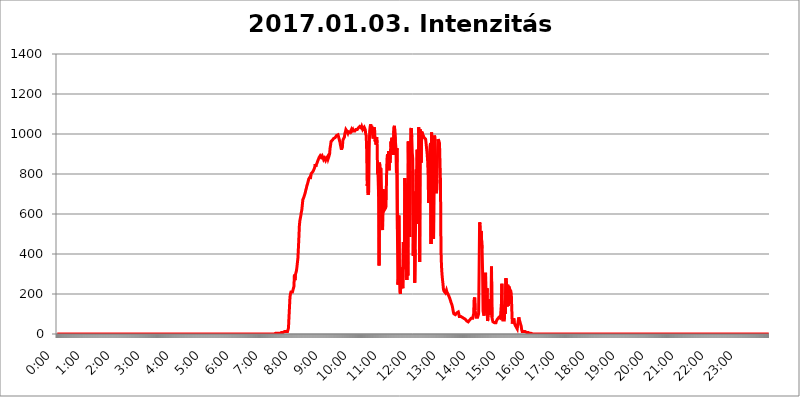
| Category | 2017.01.03. Intenzitás [W/m^2] |
|---|---|
| 0.0 | 0 |
| 0.0006944444444444445 | 0 |
| 0.001388888888888889 | 0 |
| 0.0020833333333333333 | 0 |
| 0.002777777777777778 | 0 |
| 0.003472222222222222 | 0 |
| 0.004166666666666667 | 0 |
| 0.004861111111111111 | 0 |
| 0.005555555555555556 | 0 |
| 0.0062499999999999995 | 0 |
| 0.006944444444444444 | 0 |
| 0.007638888888888889 | 0 |
| 0.008333333333333333 | 0 |
| 0.009027777777777779 | 0 |
| 0.009722222222222222 | 0 |
| 0.010416666666666666 | 0 |
| 0.011111111111111112 | 0 |
| 0.011805555555555555 | 0 |
| 0.012499999999999999 | 0 |
| 0.013194444444444444 | 0 |
| 0.013888888888888888 | 0 |
| 0.014583333333333332 | 0 |
| 0.015277777777777777 | 0 |
| 0.015972222222222224 | 0 |
| 0.016666666666666666 | 0 |
| 0.017361111111111112 | 0 |
| 0.018055555555555557 | 0 |
| 0.01875 | 0 |
| 0.019444444444444445 | 0 |
| 0.02013888888888889 | 0 |
| 0.020833333333333332 | 0 |
| 0.02152777777777778 | 0 |
| 0.022222222222222223 | 0 |
| 0.02291666666666667 | 0 |
| 0.02361111111111111 | 0 |
| 0.024305555555555556 | 0 |
| 0.024999999999999998 | 0 |
| 0.025694444444444447 | 0 |
| 0.02638888888888889 | 0 |
| 0.027083333333333334 | 0 |
| 0.027777777777777776 | 0 |
| 0.02847222222222222 | 0 |
| 0.029166666666666664 | 0 |
| 0.029861111111111113 | 0 |
| 0.030555555555555555 | 0 |
| 0.03125 | 0 |
| 0.03194444444444445 | 0 |
| 0.03263888888888889 | 0 |
| 0.03333333333333333 | 0 |
| 0.034027777777777775 | 0 |
| 0.034722222222222224 | 0 |
| 0.035416666666666666 | 0 |
| 0.036111111111111115 | 0 |
| 0.03680555555555556 | 0 |
| 0.0375 | 0 |
| 0.03819444444444444 | 0 |
| 0.03888888888888889 | 0 |
| 0.03958333333333333 | 0 |
| 0.04027777777777778 | 0 |
| 0.04097222222222222 | 0 |
| 0.041666666666666664 | 0 |
| 0.042361111111111106 | 0 |
| 0.04305555555555556 | 0 |
| 0.043750000000000004 | 0 |
| 0.044444444444444446 | 0 |
| 0.04513888888888889 | 0 |
| 0.04583333333333334 | 0 |
| 0.04652777777777778 | 0 |
| 0.04722222222222222 | 0 |
| 0.04791666666666666 | 0 |
| 0.04861111111111111 | 0 |
| 0.049305555555555554 | 0 |
| 0.049999999999999996 | 0 |
| 0.05069444444444445 | 0 |
| 0.051388888888888894 | 0 |
| 0.052083333333333336 | 0 |
| 0.05277777777777778 | 0 |
| 0.05347222222222222 | 0 |
| 0.05416666666666667 | 0 |
| 0.05486111111111111 | 0 |
| 0.05555555555555555 | 0 |
| 0.05625 | 0 |
| 0.05694444444444444 | 0 |
| 0.057638888888888885 | 0 |
| 0.05833333333333333 | 0 |
| 0.05902777777777778 | 0 |
| 0.059722222222222225 | 0 |
| 0.06041666666666667 | 0 |
| 0.061111111111111116 | 0 |
| 0.06180555555555556 | 0 |
| 0.0625 | 0 |
| 0.06319444444444444 | 0 |
| 0.06388888888888888 | 0 |
| 0.06458333333333334 | 0 |
| 0.06527777777777778 | 0 |
| 0.06597222222222222 | 0 |
| 0.06666666666666667 | 0 |
| 0.06736111111111111 | 0 |
| 0.06805555555555555 | 0 |
| 0.06874999999999999 | 0 |
| 0.06944444444444443 | 0 |
| 0.07013888888888889 | 0 |
| 0.07083333333333333 | 0 |
| 0.07152777777777779 | 0 |
| 0.07222222222222223 | 0 |
| 0.07291666666666667 | 0 |
| 0.07361111111111111 | 0 |
| 0.07430555555555556 | 0 |
| 0.075 | 0 |
| 0.07569444444444444 | 0 |
| 0.0763888888888889 | 0 |
| 0.07708333333333334 | 0 |
| 0.07777777777777778 | 0 |
| 0.07847222222222222 | 0 |
| 0.07916666666666666 | 0 |
| 0.0798611111111111 | 0 |
| 0.08055555555555556 | 0 |
| 0.08125 | 0 |
| 0.08194444444444444 | 0 |
| 0.08263888888888889 | 0 |
| 0.08333333333333333 | 0 |
| 0.08402777777777777 | 0 |
| 0.08472222222222221 | 0 |
| 0.08541666666666665 | 0 |
| 0.08611111111111112 | 0 |
| 0.08680555555555557 | 0 |
| 0.08750000000000001 | 0 |
| 0.08819444444444445 | 0 |
| 0.08888888888888889 | 0 |
| 0.08958333333333333 | 0 |
| 0.09027777777777778 | 0 |
| 0.09097222222222222 | 0 |
| 0.09166666666666667 | 0 |
| 0.09236111111111112 | 0 |
| 0.09305555555555556 | 0 |
| 0.09375 | 0 |
| 0.09444444444444444 | 0 |
| 0.09513888888888888 | 0 |
| 0.09583333333333333 | 0 |
| 0.09652777777777777 | 0 |
| 0.09722222222222222 | 0 |
| 0.09791666666666667 | 0 |
| 0.09861111111111111 | 0 |
| 0.09930555555555555 | 0 |
| 0.09999999999999999 | 0 |
| 0.10069444444444443 | 0 |
| 0.1013888888888889 | 0 |
| 0.10208333333333335 | 0 |
| 0.10277777777777779 | 0 |
| 0.10347222222222223 | 0 |
| 0.10416666666666667 | 0 |
| 0.10486111111111111 | 0 |
| 0.10555555555555556 | 0 |
| 0.10625 | 0 |
| 0.10694444444444444 | 0 |
| 0.1076388888888889 | 0 |
| 0.10833333333333334 | 0 |
| 0.10902777777777778 | 0 |
| 0.10972222222222222 | 0 |
| 0.1111111111111111 | 0 |
| 0.11180555555555556 | 0 |
| 0.11180555555555556 | 0 |
| 0.1125 | 0 |
| 0.11319444444444444 | 0 |
| 0.11388888888888889 | 0 |
| 0.11458333333333333 | 0 |
| 0.11527777777777777 | 0 |
| 0.11597222222222221 | 0 |
| 0.11666666666666665 | 0 |
| 0.1173611111111111 | 0 |
| 0.11805555555555557 | 0 |
| 0.11944444444444445 | 0 |
| 0.12013888888888889 | 0 |
| 0.12083333333333333 | 0 |
| 0.12152777777777778 | 0 |
| 0.12222222222222223 | 0 |
| 0.12291666666666667 | 0 |
| 0.12291666666666667 | 0 |
| 0.12361111111111112 | 0 |
| 0.12430555555555556 | 0 |
| 0.125 | 0 |
| 0.12569444444444444 | 0 |
| 0.12638888888888888 | 0 |
| 0.12708333333333333 | 0 |
| 0.16875 | 0 |
| 0.12847222222222224 | 0 |
| 0.12916666666666668 | 0 |
| 0.12986111111111112 | 0 |
| 0.13055555555555556 | 0 |
| 0.13125 | 0 |
| 0.13194444444444445 | 0 |
| 0.1326388888888889 | 0 |
| 0.13333333333333333 | 0 |
| 0.13402777777777777 | 0 |
| 0.13402777777777777 | 0 |
| 0.13472222222222222 | 0 |
| 0.13541666666666666 | 0 |
| 0.1361111111111111 | 0 |
| 0.13749999999999998 | 0 |
| 0.13819444444444443 | 0 |
| 0.1388888888888889 | 0 |
| 0.13958333333333334 | 0 |
| 0.14027777777777778 | 0 |
| 0.14097222222222222 | 0 |
| 0.14166666666666666 | 0 |
| 0.1423611111111111 | 0 |
| 0.14305555555555557 | 0 |
| 0.14375000000000002 | 0 |
| 0.14444444444444446 | 0 |
| 0.1451388888888889 | 0 |
| 0.1451388888888889 | 0 |
| 0.14652777777777778 | 0 |
| 0.14722222222222223 | 0 |
| 0.14791666666666667 | 0 |
| 0.1486111111111111 | 0 |
| 0.14930555555555555 | 0 |
| 0.15 | 0 |
| 0.15069444444444444 | 0 |
| 0.15138888888888888 | 0 |
| 0.15208333333333332 | 0 |
| 0.15277777777777776 | 0 |
| 0.15347222222222223 | 0 |
| 0.15416666666666667 | 0 |
| 0.15486111111111112 | 0 |
| 0.15555555555555556 | 0 |
| 0.15625 | 0 |
| 0.15694444444444444 | 0 |
| 0.15763888888888888 | 0 |
| 0.15833333333333333 | 0 |
| 0.15902777777777777 | 0 |
| 0.15972222222222224 | 0 |
| 0.16041666666666668 | 0 |
| 0.16111111111111112 | 0 |
| 0.16180555555555556 | 0 |
| 0.1625 | 0 |
| 0.16319444444444445 | 0 |
| 0.1638888888888889 | 0 |
| 0.16458333333333333 | 0 |
| 0.16527777777777777 | 0 |
| 0.16597222222222222 | 0 |
| 0.16666666666666666 | 0 |
| 0.1673611111111111 | 0 |
| 0.16805555555555554 | 0 |
| 0.16874999999999998 | 0 |
| 0.16944444444444443 | 0 |
| 0.17013888888888887 | 0 |
| 0.1708333333333333 | 0 |
| 0.17152777777777775 | 0 |
| 0.17222222222222225 | 0 |
| 0.1729166666666667 | 0 |
| 0.17361111111111113 | 0 |
| 0.17430555555555557 | 0 |
| 0.17500000000000002 | 0 |
| 0.17569444444444446 | 0 |
| 0.1763888888888889 | 0 |
| 0.17708333333333334 | 0 |
| 0.17777777777777778 | 0 |
| 0.17847222222222223 | 0 |
| 0.17916666666666667 | 0 |
| 0.1798611111111111 | 0 |
| 0.18055555555555555 | 0 |
| 0.18125 | 0 |
| 0.18194444444444444 | 0 |
| 0.1826388888888889 | 0 |
| 0.18333333333333335 | 0 |
| 0.1840277777777778 | 0 |
| 0.18472222222222223 | 0 |
| 0.18541666666666667 | 0 |
| 0.18611111111111112 | 0 |
| 0.18680555555555556 | 0 |
| 0.1875 | 0 |
| 0.18819444444444444 | 0 |
| 0.18888888888888888 | 0 |
| 0.18958333333333333 | 0 |
| 0.19027777777777777 | 0 |
| 0.1909722222222222 | 0 |
| 0.19166666666666665 | 0 |
| 0.19236111111111112 | 0 |
| 0.19305555555555554 | 0 |
| 0.19375 | 0 |
| 0.19444444444444445 | 0 |
| 0.1951388888888889 | 0 |
| 0.19583333333333333 | 0 |
| 0.19652777777777777 | 0 |
| 0.19722222222222222 | 0 |
| 0.19791666666666666 | 0 |
| 0.1986111111111111 | 0 |
| 0.19930555555555554 | 0 |
| 0.19999999999999998 | 0 |
| 0.20069444444444443 | 0 |
| 0.20138888888888887 | 0 |
| 0.2020833333333333 | 0 |
| 0.2027777777777778 | 0 |
| 0.2034722222222222 | 0 |
| 0.2041666666666667 | 0 |
| 0.20486111111111113 | 0 |
| 0.20555555555555557 | 0 |
| 0.20625000000000002 | 0 |
| 0.20694444444444446 | 0 |
| 0.2076388888888889 | 0 |
| 0.20833333333333334 | 0 |
| 0.20902777777777778 | 0 |
| 0.20972222222222223 | 0 |
| 0.21041666666666667 | 0 |
| 0.2111111111111111 | 0 |
| 0.21180555555555555 | 0 |
| 0.2125 | 0 |
| 0.21319444444444444 | 0 |
| 0.2138888888888889 | 0 |
| 0.21458333333333335 | 0 |
| 0.2152777777777778 | 0 |
| 0.21597222222222223 | 0 |
| 0.21666666666666667 | 0 |
| 0.21736111111111112 | 0 |
| 0.21805555555555556 | 0 |
| 0.21875 | 0 |
| 0.21944444444444444 | 0 |
| 0.22013888888888888 | 0 |
| 0.22083333333333333 | 0 |
| 0.22152777777777777 | 0 |
| 0.2222222222222222 | 0 |
| 0.22291666666666665 | 0 |
| 0.2236111111111111 | 0 |
| 0.22430555555555556 | 0 |
| 0.225 | 0 |
| 0.22569444444444445 | 0 |
| 0.2263888888888889 | 0 |
| 0.22708333333333333 | 0 |
| 0.22777777777777777 | 0 |
| 0.22847222222222222 | 0 |
| 0.22916666666666666 | 0 |
| 0.2298611111111111 | 0 |
| 0.23055555555555554 | 0 |
| 0.23124999999999998 | 0 |
| 0.23194444444444443 | 0 |
| 0.23263888888888887 | 0 |
| 0.2333333333333333 | 0 |
| 0.2340277777777778 | 0 |
| 0.2347222222222222 | 0 |
| 0.2354166666666667 | 0 |
| 0.23611111111111113 | 0 |
| 0.23680555555555557 | 0 |
| 0.23750000000000002 | 0 |
| 0.23819444444444446 | 0 |
| 0.2388888888888889 | 0 |
| 0.23958333333333334 | 0 |
| 0.24027777777777778 | 0 |
| 0.24097222222222223 | 0 |
| 0.24166666666666667 | 0 |
| 0.2423611111111111 | 0 |
| 0.24305555555555555 | 0 |
| 0.24375 | 0 |
| 0.24444444444444446 | 0 |
| 0.24513888888888888 | 0 |
| 0.24583333333333335 | 0 |
| 0.2465277777777778 | 0 |
| 0.24722222222222223 | 0 |
| 0.24791666666666667 | 0 |
| 0.24861111111111112 | 0 |
| 0.24930555555555556 | 0 |
| 0.25 | 0 |
| 0.25069444444444444 | 0 |
| 0.2513888888888889 | 0 |
| 0.2520833333333333 | 0 |
| 0.25277777777777777 | 0 |
| 0.2534722222222222 | 0 |
| 0.25416666666666665 | 0 |
| 0.2548611111111111 | 0 |
| 0.2555555555555556 | 0 |
| 0.25625000000000003 | 0 |
| 0.2569444444444445 | 0 |
| 0.2576388888888889 | 0 |
| 0.25833333333333336 | 0 |
| 0.2590277777777778 | 0 |
| 0.25972222222222224 | 0 |
| 0.2604166666666667 | 0 |
| 0.2611111111111111 | 0 |
| 0.26180555555555557 | 0 |
| 0.2625 | 0 |
| 0.26319444444444445 | 0 |
| 0.2638888888888889 | 0 |
| 0.26458333333333334 | 0 |
| 0.2652777777777778 | 0 |
| 0.2659722222222222 | 0 |
| 0.26666666666666666 | 0 |
| 0.2673611111111111 | 0 |
| 0.26805555555555555 | 0 |
| 0.26875 | 0 |
| 0.26944444444444443 | 0 |
| 0.2701388888888889 | 0 |
| 0.2708333333333333 | 0 |
| 0.27152777777777776 | 0 |
| 0.2722222222222222 | 0 |
| 0.27291666666666664 | 0 |
| 0.2736111111111111 | 0 |
| 0.2743055555555555 | 0 |
| 0.27499999999999997 | 0 |
| 0.27569444444444446 | 0 |
| 0.27638888888888885 | 0 |
| 0.27708333333333335 | 0 |
| 0.2777777777777778 | 0 |
| 0.27847222222222223 | 0 |
| 0.2791666666666667 | 0 |
| 0.2798611111111111 | 0 |
| 0.28055555555555556 | 0 |
| 0.28125 | 0 |
| 0.28194444444444444 | 0 |
| 0.2826388888888889 | 0 |
| 0.2833333333333333 | 0 |
| 0.28402777777777777 | 0 |
| 0.2847222222222222 | 0 |
| 0.28541666666666665 | 0 |
| 0.28611111111111115 | 0 |
| 0.28680555555555554 | 0 |
| 0.28750000000000003 | 0 |
| 0.2881944444444445 | 0 |
| 0.2888888888888889 | 0 |
| 0.28958333333333336 | 0 |
| 0.2902777777777778 | 0 |
| 0.29097222222222224 | 0 |
| 0.2916666666666667 | 0 |
| 0.2923611111111111 | 0 |
| 0.29305555555555557 | 0 |
| 0.29375 | 0 |
| 0.29444444444444445 | 0 |
| 0.2951388888888889 | 0 |
| 0.29583333333333334 | 0 |
| 0.2965277777777778 | 0 |
| 0.2972222222222222 | 0 |
| 0.29791666666666666 | 0 |
| 0.2986111111111111 | 0 |
| 0.29930555555555555 | 0 |
| 0.3 | 0 |
| 0.30069444444444443 | 0 |
| 0.3013888888888889 | 0 |
| 0.3020833333333333 | 0 |
| 0.30277777777777776 | 0 |
| 0.3034722222222222 | 0 |
| 0.30416666666666664 | 0 |
| 0.3048611111111111 | 0 |
| 0.3055555555555555 | 0 |
| 0.30624999999999997 | 3.525 |
| 0.3069444444444444 | 3.525 |
| 0.3076388888888889 | 3.525 |
| 0.30833333333333335 | 3.525 |
| 0.3090277777777778 | 3.525 |
| 0.30972222222222223 | 3.525 |
| 0.3104166666666667 | 3.525 |
| 0.3111111111111111 | 3.525 |
| 0.31180555555555556 | 3.525 |
| 0.3125 | 3.525 |
| 0.31319444444444444 | 3.525 |
| 0.3138888888888889 | 7.887 |
| 0.3145833333333333 | 7.887 |
| 0.31527777777777777 | 7.887 |
| 0.3159722222222222 | 7.887 |
| 0.31666666666666665 | 7.887 |
| 0.31736111111111115 | 7.887 |
| 0.31805555555555554 | 7.887 |
| 0.31875000000000003 | 12.257 |
| 0.3194444444444445 | 12.257 |
| 0.3201388888888889 | 12.257 |
| 0.32083333333333336 | 12.257 |
| 0.3215277777777778 | 12.257 |
| 0.32222222222222224 | 12.257 |
| 0.3229166666666667 | 12.257 |
| 0.3236111111111111 | 21.024 |
| 0.32430555555555557 | 29.823 |
| 0.325 | 83.205 |
| 0.32569444444444445 | 132.814 |
| 0.3263888888888889 | 182.82 |
| 0.32708333333333334 | 201.058 |
| 0.3277777777777778 | 210.182 |
| 0.3284722222222222 | 214.746 |
| 0.32916666666666666 | 210.182 |
| 0.3298611111111111 | 210.182 |
| 0.33055555555555555 | 210.182 |
| 0.33125 | 228.436 |
| 0.33194444444444443 | 237.564 |
| 0.3326388888888889 | 296.808 |
| 0.3333333333333333 | 269.49 |
| 0.3340277777777778 | 296.808 |
| 0.3347222222222222 | 301.354 |
| 0.3354166666666667 | 314.98 |
| 0.3361111111111111 | 333.113 |
| 0.3368055555555556 | 333.113 |
| 0.33749999999999997 | 378.224 |
| 0.33819444444444446 | 427.39 |
| 0.33888888888888885 | 480.356 |
| 0.33958333333333335 | 541.121 |
| 0.34027777777777773 | 566.793 |
| 0.34097222222222223 | 579.542 |
| 0.3416666666666666 | 592.233 |
| 0.3423611111111111 | 609.062 |
| 0.3430555555555555 | 621.613 |
| 0.34375 | 646.537 |
| 0.3444444444444445 | 671.22 |
| 0.3451388888888889 | 671.22 |
| 0.3458333333333334 | 683.473 |
| 0.34652777777777777 | 683.473 |
| 0.34722222222222227 | 699.717 |
| 0.34791666666666665 | 707.8 |
| 0.34861111111111115 | 719.877 |
| 0.34930555555555554 | 727.896 |
| 0.35000000000000003 | 739.877 |
| 0.3506944444444444 | 743.859 |
| 0.3513888888888889 | 755.766 |
| 0.3520833333333333 | 759.723 |
| 0.3527777777777778 | 775.492 |
| 0.3534722222222222 | 779.42 |
| 0.3541666666666667 | 783.342 |
| 0.3548611111111111 | 775.492 |
| 0.35555555555555557 | 787.258 |
| 0.35625 | 802.868 |
| 0.35694444444444445 | 802.868 |
| 0.3576388888888889 | 802.868 |
| 0.35833333333333334 | 810.641 |
| 0.3590277777777778 | 814.519 |
| 0.3597222222222222 | 810.641 |
| 0.36041666666666666 | 826.123 |
| 0.3611111111111111 | 833.834 |
| 0.36180555555555555 | 849.199 |
| 0.3625 | 837.682 |
| 0.36319444444444443 | 845.365 |
| 0.3638888888888889 | 849.199 |
| 0.3645833333333333 | 856.855 |
| 0.3652777777777778 | 864.493 |
| 0.3659722222222222 | 864.493 |
| 0.3666666666666667 | 868.305 |
| 0.3673611111111111 | 883.516 |
| 0.3680555555555556 | 887.309 |
| 0.36874999999999997 | 891.099 |
| 0.36944444444444446 | 891.099 |
| 0.37013888888888885 | 883.516 |
| 0.37083333333333335 | 883.516 |
| 0.37152777777777773 | 891.099 |
| 0.37222222222222223 | 887.309 |
| 0.3729166666666666 | 879.719 |
| 0.3736111111111111 | 872.114 |
| 0.3743055555555555 | 872.114 |
| 0.375 | 879.719 |
| 0.3756944444444445 | 875.918 |
| 0.3763888888888889 | 868.305 |
| 0.3770833333333334 | 868.305 |
| 0.37777777777777777 | 879.719 |
| 0.37847222222222227 | 883.516 |
| 0.37916666666666665 | 887.309 |
| 0.37986111111111115 | 875.918 |
| 0.38055555555555554 | 875.918 |
| 0.38125000000000003 | 879.719 |
| 0.3819444444444444 | 898.668 |
| 0.3826388888888889 | 928.819 |
| 0.3833333333333333 | 943.832 |
| 0.3840277777777778 | 962.555 |
| 0.3847222222222222 | 958.814 |
| 0.3854166666666667 | 962.555 |
| 0.3861111111111111 | 970.034 |
| 0.38680555555555557 | 970.034 |
| 0.3875 | 977.508 |
| 0.38819444444444445 | 981.244 |
| 0.3888888888888889 | 977.508 |
| 0.38958333333333334 | 981.244 |
| 0.3902777777777778 | 981.244 |
| 0.3909722222222222 | 984.98 |
| 0.39166666666666666 | 992.448 |
| 0.3923611111111111 | 992.448 |
| 0.39305555555555555 | 992.448 |
| 0.39375 | 996.182 |
| 0.39444444444444443 | 996.182 |
| 0.3951388888888889 | 977.508 |
| 0.3958333333333333 | 977.508 |
| 0.3965277777777778 | 958.814 |
| 0.3972222222222222 | 943.832 |
| 0.3979166666666667 | 932.576 |
| 0.3986111111111111 | 921.298 |
| 0.3993055555555556 | 917.534 |
| 0.39999999999999997 | 940.082 |
| 0.40069444444444446 | 970.034 |
| 0.40138888888888885 | 970.034 |
| 0.40208333333333335 | 973.772 |
| 0.40277777777777773 | 984.98 |
| 0.40347222222222223 | 1003.65 |
| 0.4041666666666666 | 1011.118 |
| 0.4048611111111111 | 1022.323 |
| 0.4055555555555555 | 1026.06 |
| 0.40625 | 1014.852 |
| 0.4069444444444445 | 1014.852 |
| 0.4076388888888889 | 1003.65 |
| 0.4083333333333334 | 1011.118 |
| 0.40902777777777777 | 1007.383 |
| 0.40972222222222227 | 1011.118 |
| 0.41041666666666665 | 1007.383 |
| 0.41111111111111115 | 1007.383 |
| 0.41180555555555554 | 1011.118 |
| 0.41250000000000003 | 1022.323 |
| 0.4131944444444444 | 1014.852 |
| 0.4138888888888889 | 1014.852 |
| 0.4145833333333333 | 1022.323 |
| 0.4152777777777778 | 1014.852 |
| 0.4159722222222222 | 1014.852 |
| 0.4166666666666667 | 1014.852 |
| 0.4173611111111111 | 1014.852 |
| 0.41805555555555557 | 1018.587 |
| 0.41875 | 1022.323 |
| 0.41944444444444445 | 1018.587 |
| 0.4201388888888889 | 1022.323 |
| 0.42083333333333334 | 1022.323 |
| 0.4215277777777778 | 1018.587 |
| 0.4222222222222222 | 1029.798 |
| 0.42291666666666666 | 1029.798 |
| 0.4236111111111111 | 1029.798 |
| 0.42430555555555555 | 1037.277 |
| 0.425 | 1041.019 |
| 0.42569444444444443 | 1037.277 |
| 0.4263888888888889 | 1029.798 |
| 0.4270833333333333 | 1037.277 |
| 0.4277777777777778 | 1033.537 |
| 0.4284722222222222 | 1022.323 |
| 0.4291666666666667 | 1018.587 |
| 0.4298611111111111 | 1018.587 |
| 0.4305555555555556 | 1033.537 |
| 0.43124999999999997 | 1029.798 |
| 0.43194444444444446 | 1022.323 |
| 0.43263888888888885 | 999.916 |
| 0.43333333333333335 | 992.448 |
| 0.43402777777777773 | 913.766 |
| 0.43472222222222223 | 739.877 |
| 0.4354166666666666 | 767.62 |
| 0.4361111111111111 | 695.666 |
| 0.4368055555555555 | 711.832 |
| 0.4375 | 925.06 |
| 0.4381944444444445 | 1014.852 |
| 0.4388888888888889 | 1037.277 |
| 0.4395833333333334 | 1048.508 |
| 0.44027777777777777 | 1026.06 |
| 0.44097222222222227 | 1041.019 |
| 0.44166666666666665 | 1014.852 |
| 0.44236111111111115 | 996.182 |
| 0.44305555555555554 | 977.508 |
| 0.44375000000000003 | 1026.06 |
| 0.4444444444444444 | 1033.537 |
| 0.4451388888888889 | 1018.587 |
| 0.4458333333333333 | 962.555 |
| 0.4465277777777778 | 977.508 |
| 0.4472222222222222 | 947.58 |
| 0.4479166666666667 | 984.98 |
| 0.4486111111111111 | 955.071 |
| 0.44930555555555557 | 798.974 |
| 0.45 | 841.526 |
| 0.45069444444444445 | 687.544 |
| 0.4513888888888889 | 342.162 |
| 0.45208333333333334 | 856.855 |
| 0.4527777777777778 | 767.62 |
| 0.4534722222222222 | 829.981 |
| 0.45416666666666666 | 822.26 |
| 0.4548611111111111 | 695.666 |
| 0.45555555555555555 | 583.779 |
| 0.45625 | 519.555 |
| 0.45694444444444443 | 723.889 |
| 0.4576388888888889 | 719.877 |
| 0.4583333333333333 | 617.436 |
| 0.4590277777777778 | 617.436 |
| 0.4597222222222222 | 617.436 |
| 0.4604166666666667 | 629.948 |
| 0.4611111111111111 | 638.256 |
| 0.4618055555555556 | 779.42 |
| 0.46249999999999997 | 875.918 |
| 0.46319444444444446 | 898.668 |
| 0.46388888888888885 | 845.365 |
| 0.46458333333333335 | 913.766 |
| 0.46527777777777773 | 818.392 |
| 0.46597222222222223 | 875.918 |
| 0.4666666666666666 | 856.855 |
| 0.4673611111111111 | 909.996 |
| 0.4680555555555555 | 962.555 |
| 0.46875 | 928.819 |
| 0.4694444444444445 | 981.244 |
| 0.4701388888888889 | 921.298 |
| 0.4708333333333334 | 947.58 |
| 0.47152777777777777 | 894.885 |
| 0.47222222222222227 | 1033.537 |
| 0.47291666666666665 | 1041.019 |
| 0.47361111111111115 | 1044.762 |
| 0.47430555555555554 | 962.555 |
| 0.47500000000000003 | 932.576 |
| 0.4756944444444444 | 806.757 |
| 0.4763888888888889 | 928.819 |
| 0.4770833333333333 | 523.88 |
| 0.4777777777777778 | 246.689 |
| 0.4784722222222222 | 274.047 |
| 0.4791666666666667 | 592.233 |
| 0.4798611111111111 | 328.584 |
| 0.48055555555555557 | 210.182 |
| 0.48125 | 201.058 |
| 0.48194444444444445 | 246.689 |
| 0.4826388888888889 | 255.813 |
| 0.48333333333333334 | 333.113 |
| 0.4840277777777778 | 237.564 |
| 0.4847222222222222 | 228.436 |
| 0.48541666666666666 | 458.38 |
| 0.4861111111111111 | 405.108 |
| 0.48680555555555555 | 333.113 |
| 0.4875 | 779.42 |
| 0.48819444444444443 | 715.858 |
| 0.4888888888888889 | 324.052 |
| 0.4895833333333333 | 667.123 |
| 0.4902777777777778 | 269.49 |
| 0.4909722222222222 | 751.803 |
| 0.4916666666666667 | 292.259 |
| 0.4923611111111111 | 962.555 |
| 0.4930555555555556 | 707.8 |
| 0.49374999999999997 | 575.299 |
| 0.49444444444444446 | 484.735 |
| 0.49513888888888885 | 814.519 |
| 0.49583333333333335 | 1022.323 |
| 0.49652777777777773 | 1029.798 |
| 0.49722222222222223 | 984.98 |
| 0.4979166666666666 | 906.223 |
| 0.4986111111111111 | 875.918 |
| 0.4993055555555555 | 391.685 |
| 0.5 | 711.832 |
| 0.5006944444444444 | 654.791 |
| 0.5013888888888889 | 255.813 |
| 0.5020833333333333 | 422.943 |
| 0.5027777777777778 | 609.062 |
| 0.5034722222222222 | 822.26 |
| 0.5041666666666667 | 579.542 |
| 0.5048611111111111 | 921.298 |
| 0.5055555555555555 | 549.704 |
| 0.50625 | 739.877 |
| 0.5069444444444444 | 1033.537 |
| 0.5076388888888889 | 977.508 |
| 0.5083333333333333 | 360.221 |
| 0.5090277777777777 | 1022.323 |
| 0.5097222222222222 | 999.916 |
| 0.5104166666666666 | 856.855 |
| 0.5111111111111112 | 1011.118 |
| 0.5118055555555555 | 1007.383 |
| 0.5125000000000001 | 999.916 |
| 0.5131944444444444 | 999.916 |
| 0.513888888888889 | 996.182 |
| 0.5145833333333333 | 981.244 |
| 0.5152777777777778 | 984.98 |
| 0.5159722222222222 | 981.244 |
| 0.5166666666666667 | 973.772 |
| 0.517361111111111 | 951.327 |
| 0.5180555555555556 | 947.58 |
| 0.5187499999999999 | 902.447 |
| 0.5194444444444445 | 868.305 |
| 0.5201388888888888 | 802.868 |
| 0.5208333333333334 | 654.791 |
| 0.5215277777777778 | 663.019 |
| 0.5222222222222223 | 898.668 |
| 0.5229166666666667 | 940.082 |
| 0.5236111111111111 | 955.071 |
| 0.5243055555555556 | 449.551 |
| 0.525 | 1007.383 |
| 0.5256944444444445 | 1011.118 |
| 0.5263888888888889 | 667.123 |
| 0.5270833333333333 | 532.513 |
| 0.5277777777777778 | 475.972 |
| 0.5284722222222222 | 841.526 |
| 0.5291666666666667 | 992.448 |
| 0.5298611111111111 | 966.295 |
| 0.5305555555555556 | 822.26 |
| 0.53125 | 787.258 |
| 0.5319444444444444 | 703.762 |
| 0.5326388888888889 | 771.559 |
| 0.5333333333333333 | 891.099 |
| 0.5340277777777778 | 973.772 |
| 0.5347222222222222 | 977.508 |
| 0.5354166666666667 | 962.555 |
| 0.5361111111111111 | 955.071 |
| 0.5368055555555555 | 951.327 |
| 0.5375 | 759.723 |
| 0.5381944444444444 | 418.492 |
| 0.5388888888888889 | 342.162 |
| 0.5395833333333333 | 301.354 |
| 0.5402777777777777 | 274.047 |
| 0.5409722222222222 | 251.251 |
| 0.5416666666666666 | 223.873 |
| 0.5423611111111112 | 214.746 |
| 0.5430555555555555 | 210.182 |
| 0.5437500000000001 | 210.182 |
| 0.5444444444444444 | 205.62 |
| 0.545138888888889 | 210.182 |
| 0.5458333333333333 | 219.309 |
| 0.5465277777777778 | 210.182 |
| 0.5472222222222222 | 205.62 |
| 0.5479166666666667 | 201.058 |
| 0.548611111111111 | 201.058 |
| 0.5493055555555556 | 196.497 |
| 0.5499999999999999 | 182.82 |
| 0.5506944444444445 | 178.264 |
| 0.5513888888888888 | 169.156 |
| 0.5520833333333334 | 160.056 |
| 0.5527777777777778 | 155.509 |
| 0.5534722222222223 | 146.423 |
| 0.5541666666666667 | 137.347 |
| 0.5548611111111111 | 123.758 |
| 0.5555555555555556 | 110.201 |
| 0.55625 | 101.184 |
| 0.5569444444444445 | 96.682 |
| 0.5576388888888889 | 96.682 |
| 0.5583333333333333 | 96.682 |
| 0.5590277777777778 | 101.184 |
| 0.5597222222222222 | 101.184 |
| 0.5604166666666667 | 105.69 |
| 0.5611111111111111 | 110.201 |
| 0.5618055555555556 | 110.201 |
| 0.5625 | 110.201 |
| 0.5631944444444444 | 101.184 |
| 0.5638888888888889 | 87.692 |
| 0.5645833333333333 | 83.205 |
| 0.5652777777777778 | 83.205 |
| 0.5659722222222222 | 87.692 |
| 0.5666666666666667 | 87.692 |
| 0.5673611111111111 | 92.184 |
| 0.5680555555555555 | 83.205 |
| 0.56875 | 87.692 |
| 0.5694444444444444 | 78.722 |
| 0.5701388888888889 | 78.722 |
| 0.5708333333333333 | 74.246 |
| 0.5715277777777777 | 74.246 |
| 0.5722222222222222 | 74.246 |
| 0.5729166666666666 | 74.246 |
| 0.5736111111111112 | 69.775 |
| 0.5743055555555555 | 65.31 |
| 0.5750000000000001 | 65.31 |
| 0.5756944444444444 | 65.31 |
| 0.576388888888889 | 60.85 |
| 0.5770833333333333 | 65.31 |
| 0.5777777777777778 | 65.31 |
| 0.5784722222222222 | 69.775 |
| 0.5791666666666667 | 74.246 |
| 0.579861111111111 | 74.246 |
| 0.5805555555555556 | 78.722 |
| 0.5812499999999999 | 78.722 |
| 0.5819444444444445 | 83.205 |
| 0.5826388888888888 | 78.722 |
| 0.5833333333333334 | 78.722 |
| 0.5840277777777778 | 101.184 |
| 0.5847222222222223 | 173.709 |
| 0.5854166666666667 | 182.82 |
| 0.5861111111111111 | 119.235 |
| 0.5868055555555556 | 101.184 |
| 0.5875 | 83.205 |
| 0.5881944444444445 | 78.722 |
| 0.5888888888888889 | 78.722 |
| 0.5895833333333333 | 83.205 |
| 0.5902777777777778 | 87.692 |
| 0.5909722222222222 | 101.184 |
| 0.5916666666666667 | 314.98 |
| 0.5923611111111111 | 558.261 |
| 0.5930555555555556 | 549.704 |
| 0.59375 | 440.702 |
| 0.5944444444444444 | 515.223 |
| 0.5951388888888889 | 515.223 |
| 0.5958333333333333 | 427.39 |
| 0.5965277777777778 | 319.517 |
| 0.5972222222222222 | 114.716 |
| 0.5979166666666667 | 101.184 |
| 0.5986111111111111 | 92.184 |
| 0.5993055555555555 | 96.682 |
| 0.6 | 137.347 |
| 0.6006944444444444 | 305.898 |
| 0.6013888888888889 | 123.758 |
| 0.6020833333333333 | 119.235 |
| 0.6027777777777777 | 228.436 |
| 0.6034722222222222 | 65.31 |
| 0.6041666666666666 | 74.246 |
| 0.6048611111111112 | 74.246 |
| 0.6055555555555555 | 173.709 |
| 0.6062500000000001 | 96.682 |
| 0.6069444444444444 | 101.184 |
| 0.607638888888889 | 101.184 |
| 0.6083333333333333 | 141.884 |
| 0.6090277777777778 | 337.639 |
| 0.6097222222222222 | 83.205 |
| 0.6104166666666667 | 69.775 |
| 0.611111111111111 | 60.85 |
| 0.6118055555555556 | 56.398 |
| 0.6124999999999999 | 56.398 |
| 0.6131944444444445 | 56.398 |
| 0.6138888888888888 | 56.398 |
| 0.6145833333333334 | 56.398 |
| 0.6152777777777778 | 56.398 |
| 0.6159722222222223 | 65.31 |
| 0.6166666666666667 | 69.775 |
| 0.6173611111111111 | 74.246 |
| 0.6180555555555556 | 74.246 |
| 0.61875 | 78.722 |
| 0.6194444444444445 | 83.205 |
| 0.6201388888888889 | 83.205 |
| 0.6208333333333333 | 83.205 |
| 0.6215277777777778 | 78.722 |
| 0.6222222222222222 | 78.722 |
| 0.6229166666666667 | 150.964 |
| 0.6236111111111111 | 251.251 |
| 0.6243055555555556 | 83.205 |
| 0.625 | 69.775 |
| 0.6256944444444444 | 69.775 |
| 0.6263888888888889 | 69.775 |
| 0.6270833333333333 | 69.775 |
| 0.6277777777777778 | 146.423 |
| 0.6284722222222222 | 101.184 |
| 0.6291666666666667 | 278.603 |
| 0.6298611111111111 | 269.49 |
| 0.6305555555555555 | 264.932 |
| 0.63125 | 137.347 |
| 0.6319444444444444 | 246.689 |
| 0.6326388888888889 | 141.884 |
| 0.6333333333333333 | 237.564 |
| 0.6340277777777777 | 228.436 |
| 0.6347222222222222 | 223.873 |
| 0.6354166666666666 | 223.873 |
| 0.6361111111111112 | 214.746 |
| 0.6368055555555555 | 201.058 |
| 0.6375000000000001 | 205.62 |
| 0.6381944444444444 | 51.951 |
| 0.638888888888889 | 60.85 |
| 0.6395833333333333 | 69.775 |
| 0.6402777777777778 | 78.722 |
| 0.6409722222222222 | 56.398 |
| 0.6416666666666667 | 51.951 |
| 0.642361111111111 | 43.079 |
| 0.6430555555555556 | 38.653 |
| 0.6437499999999999 | 34.234 |
| 0.6444444444444445 | 29.823 |
| 0.6451388888888888 | 25.419 |
| 0.6458333333333334 | 29.823 |
| 0.6465277777777778 | 65.31 |
| 0.6472222222222223 | 83.205 |
| 0.6479166666666667 | 74.246 |
| 0.6486111111111111 | 69.775 |
| 0.6493055555555556 | 56.398 |
| 0.65 | 56.398 |
| 0.6506944444444445 | 38.653 |
| 0.6513888888888889 | 21.024 |
| 0.6520833333333333 | 12.257 |
| 0.6527777777777778 | 12.257 |
| 0.6534722222222222 | 12.257 |
| 0.6541666666666667 | 12.257 |
| 0.6548611111111111 | 12.257 |
| 0.6555555555555556 | 12.257 |
| 0.65625 | 12.257 |
| 0.6569444444444444 | 12.257 |
| 0.6576388888888889 | 7.887 |
| 0.6583333333333333 | 7.887 |
| 0.6590277777777778 | 7.887 |
| 0.6597222222222222 | 7.887 |
| 0.6604166666666667 | 7.887 |
| 0.6611111111111111 | 3.525 |
| 0.6618055555555555 | 3.525 |
| 0.6625 | 3.525 |
| 0.6631944444444444 | 3.525 |
| 0.6638888888888889 | 3.525 |
| 0.6645833333333333 | 3.525 |
| 0.6652777777777777 | 0 |
| 0.6659722222222222 | 3.525 |
| 0.6666666666666666 | 0 |
| 0.6673611111111111 | 0 |
| 0.6680555555555556 | 0 |
| 0.6687500000000001 | 0 |
| 0.6694444444444444 | 0 |
| 0.6701388888888888 | 0 |
| 0.6708333333333334 | 0 |
| 0.6715277777777778 | 0 |
| 0.6722222222222222 | 0 |
| 0.6729166666666666 | 0 |
| 0.6736111111111112 | 0 |
| 0.6743055555555556 | 0 |
| 0.6749999999999999 | 0 |
| 0.6756944444444444 | 0 |
| 0.6763888888888889 | 0 |
| 0.6770833333333334 | 0 |
| 0.6777777777777777 | 0 |
| 0.6784722222222223 | 0 |
| 0.6791666666666667 | 0 |
| 0.6798611111111111 | 0 |
| 0.6805555555555555 | 0 |
| 0.68125 | 0 |
| 0.6819444444444445 | 0 |
| 0.6826388888888889 | 0 |
| 0.6833333333333332 | 0 |
| 0.6840277777777778 | 0 |
| 0.6847222222222222 | 0 |
| 0.6854166666666667 | 0 |
| 0.686111111111111 | 0 |
| 0.6868055555555556 | 0 |
| 0.6875 | 0 |
| 0.6881944444444444 | 0 |
| 0.688888888888889 | 0 |
| 0.6895833333333333 | 0 |
| 0.6902777777777778 | 0 |
| 0.6909722222222222 | 0 |
| 0.6916666666666668 | 0 |
| 0.6923611111111111 | 0 |
| 0.6930555555555555 | 0 |
| 0.69375 | 0 |
| 0.6944444444444445 | 0 |
| 0.6951388888888889 | 0 |
| 0.6958333333333333 | 0 |
| 0.6965277777777777 | 0 |
| 0.6972222222222223 | 0 |
| 0.6979166666666666 | 0 |
| 0.6986111111111111 | 0 |
| 0.6993055555555556 | 0 |
| 0.7000000000000001 | 0 |
| 0.7006944444444444 | 0 |
| 0.7013888888888888 | 0 |
| 0.7020833333333334 | 0 |
| 0.7027777777777778 | 0 |
| 0.7034722222222222 | 0 |
| 0.7041666666666666 | 0 |
| 0.7048611111111112 | 0 |
| 0.7055555555555556 | 0 |
| 0.7062499999999999 | 0 |
| 0.7069444444444444 | 0 |
| 0.7076388888888889 | 0 |
| 0.7083333333333334 | 0 |
| 0.7090277777777777 | 0 |
| 0.7097222222222223 | 0 |
| 0.7104166666666667 | 0 |
| 0.7111111111111111 | 0 |
| 0.7118055555555555 | 0 |
| 0.7125 | 0 |
| 0.7131944444444445 | 0 |
| 0.7138888888888889 | 0 |
| 0.7145833333333332 | 0 |
| 0.7152777777777778 | 0 |
| 0.7159722222222222 | 0 |
| 0.7166666666666667 | 0 |
| 0.717361111111111 | 0 |
| 0.7180555555555556 | 0 |
| 0.71875 | 0 |
| 0.7194444444444444 | 0 |
| 0.720138888888889 | 0 |
| 0.7208333333333333 | 0 |
| 0.7215277777777778 | 0 |
| 0.7222222222222222 | 0 |
| 0.7229166666666668 | 0 |
| 0.7236111111111111 | 0 |
| 0.7243055555555555 | 0 |
| 0.725 | 0 |
| 0.7256944444444445 | 0 |
| 0.7263888888888889 | 0 |
| 0.7270833333333333 | 0 |
| 0.7277777777777777 | 0 |
| 0.7284722222222223 | 0 |
| 0.7291666666666666 | 0 |
| 0.7298611111111111 | 0 |
| 0.7305555555555556 | 0 |
| 0.7312500000000001 | 0 |
| 0.7319444444444444 | 0 |
| 0.7326388888888888 | 0 |
| 0.7333333333333334 | 0 |
| 0.7340277777777778 | 0 |
| 0.7347222222222222 | 0 |
| 0.7354166666666666 | 0 |
| 0.7361111111111112 | 0 |
| 0.7368055555555556 | 0 |
| 0.7374999999999999 | 0 |
| 0.7381944444444444 | 0 |
| 0.7388888888888889 | 0 |
| 0.7395833333333334 | 0 |
| 0.7402777777777777 | 0 |
| 0.7409722222222223 | 0 |
| 0.7416666666666667 | 0 |
| 0.7423611111111111 | 0 |
| 0.7430555555555555 | 0 |
| 0.74375 | 0 |
| 0.7444444444444445 | 0 |
| 0.7451388888888889 | 0 |
| 0.7458333333333332 | 0 |
| 0.7465277777777778 | 0 |
| 0.7472222222222222 | 0 |
| 0.7479166666666667 | 0 |
| 0.748611111111111 | 0 |
| 0.7493055555555556 | 0 |
| 0.75 | 0 |
| 0.7506944444444444 | 0 |
| 0.751388888888889 | 0 |
| 0.7520833333333333 | 0 |
| 0.7527777777777778 | 0 |
| 0.7534722222222222 | 0 |
| 0.7541666666666668 | 0 |
| 0.7548611111111111 | 0 |
| 0.7555555555555555 | 0 |
| 0.75625 | 0 |
| 0.7569444444444445 | 0 |
| 0.7576388888888889 | 0 |
| 0.7583333333333333 | 0 |
| 0.7590277777777777 | 0 |
| 0.7597222222222223 | 0 |
| 0.7604166666666666 | 0 |
| 0.7611111111111111 | 0 |
| 0.7618055555555556 | 0 |
| 0.7625000000000001 | 0 |
| 0.7631944444444444 | 0 |
| 0.7638888888888888 | 0 |
| 0.7645833333333334 | 0 |
| 0.7652777777777778 | 0 |
| 0.7659722222222222 | 0 |
| 0.7666666666666666 | 0 |
| 0.7673611111111112 | 0 |
| 0.7680555555555556 | 0 |
| 0.7687499999999999 | 0 |
| 0.7694444444444444 | 0 |
| 0.7701388888888889 | 0 |
| 0.7708333333333334 | 0 |
| 0.7715277777777777 | 0 |
| 0.7722222222222223 | 0 |
| 0.7729166666666667 | 0 |
| 0.7736111111111111 | 0 |
| 0.7743055555555555 | 0 |
| 0.775 | 0 |
| 0.7756944444444445 | 0 |
| 0.7763888888888889 | 0 |
| 0.7770833333333332 | 0 |
| 0.7777777777777778 | 0 |
| 0.7784722222222222 | 0 |
| 0.7791666666666667 | 0 |
| 0.779861111111111 | 0 |
| 0.7805555555555556 | 0 |
| 0.78125 | 0 |
| 0.7819444444444444 | 0 |
| 0.782638888888889 | 0 |
| 0.7833333333333333 | 0 |
| 0.7840277777777778 | 0 |
| 0.7847222222222222 | 0 |
| 0.7854166666666668 | 0 |
| 0.7861111111111111 | 0 |
| 0.7868055555555555 | 0 |
| 0.7875 | 0 |
| 0.7881944444444445 | 0 |
| 0.7888888888888889 | 0 |
| 0.7895833333333333 | 0 |
| 0.7902777777777777 | 0 |
| 0.7909722222222223 | 0 |
| 0.7916666666666666 | 0 |
| 0.7923611111111111 | 0 |
| 0.7930555555555556 | 0 |
| 0.7937500000000001 | 0 |
| 0.7944444444444444 | 0 |
| 0.7951388888888888 | 0 |
| 0.7958333333333334 | 0 |
| 0.7965277777777778 | 0 |
| 0.7972222222222222 | 0 |
| 0.7979166666666666 | 0 |
| 0.7986111111111112 | 0 |
| 0.7993055555555556 | 0 |
| 0.7999999999999999 | 0 |
| 0.8006944444444444 | 0 |
| 0.8013888888888889 | 0 |
| 0.8020833333333334 | 0 |
| 0.8027777777777777 | 0 |
| 0.8034722222222223 | 0 |
| 0.8041666666666667 | 0 |
| 0.8048611111111111 | 0 |
| 0.8055555555555555 | 0 |
| 0.80625 | 0 |
| 0.8069444444444445 | 0 |
| 0.8076388888888889 | 0 |
| 0.8083333333333332 | 0 |
| 0.8090277777777778 | 0 |
| 0.8097222222222222 | 0 |
| 0.8104166666666667 | 0 |
| 0.811111111111111 | 0 |
| 0.8118055555555556 | 0 |
| 0.8125 | 0 |
| 0.8131944444444444 | 0 |
| 0.813888888888889 | 0 |
| 0.8145833333333333 | 0 |
| 0.8152777777777778 | 0 |
| 0.8159722222222222 | 0 |
| 0.8166666666666668 | 0 |
| 0.8173611111111111 | 0 |
| 0.8180555555555555 | 0 |
| 0.81875 | 0 |
| 0.8194444444444445 | 0 |
| 0.8201388888888889 | 0 |
| 0.8208333333333333 | 0 |
| 0.8215277777777777 | 0 |
| 0.8222222222222223 | 0 |
| 0.8229166666666666 | 0 |
| 0.8236111111111111 | 0 |
| 0.8243055555555556 | 0 |
| 0.8250000000000001 | 0 |
| 0.8256944444444444 | 0 |
| 0.8263888888888888 | 0 |
| 0.8270833333333334 | 0 |
| 0.8277777777777778 | 0 |
| 0.8284722222222222 | 0 |
| 0.8291666666666666 | 0 |
| 0.8298611111111112 | 0 |
| 0.8305555555555556 | 0 |
| 0.8312499999999999 | 0 |
| 0.8319444444444444 | 0 |
| 0.8326388888888889 | 0 |
| 0.8333333333333334 | 0 |
| 0.8340277777777777 | 0 |
| 0.8347222222222223 | 0 |
| 0.8354166666666667 | 0 |
| 0.8361111111111111 | 0 |
| 0.8368055555555555 | 0 |
| 0.8375 | 0 |
| 0.8381944444444445 | 0 |
| 0.8388888888888889 | 0 |
| 0.8395833333333332 | 0 |
| 0.8402777777777778 | 0 |
| 0.8409722222222222 | 0 |
| 0.8416666666666667 | 0 |
| 0.842361111111111 | 0 |
| 0.8430555555555556 | 0 |
| 0.84375 | 0 |
| 0.8444444444444444 | 0 |
| 0.845138888888889 | 0 |
| 0.8458333333333333 | 0 |
| 0.8465277777777778 | 0 |
| 0.8472222222222222 | 0 |
| 0.8479166666666668 | 0 |
| 0.8486111111111111 | 0 |
| 0.8493055555555555 | 0 |
| 0.85 | 0 |
| 0.8506944444444445 | 0 |
| 0.8513888888888889 | 0 |
| 0.8520833333333333 | 0 |
| 0.8527777777777777 | 0 |
| 0.8534722222222223 | 0 |
| 0.8541666666666666 | 0 |
| 0.8548611111111111 | 0 |
| 0.8555555555555556 | 0 |
| 0.8562500000000001 | 0 |
| 0.8569444444444444 | 0 |
| 0.8576388888888888 | 0 |
| 0.8583333333333334 | 0 |
| 0.8590277777777778 | 0 |
| 0.8597222222222222 | 0 |
| 0.8604166666666666 | 0 |
| 0.8611111111111112 | 0 |
| 0.8618055555555556 | 0 |
| 0.8624999999999999 | 0 |
| 0.8631944444444444 | 0 |
| 0.8638888888888889 | 0 |
| 0.8645833333333334 | 0 |
| 0.8652777777777777 | 0 |
| 0.8659722222222223 | 0 |
| 0.8666666666666667 | 0 |
| 0.8673611111111111 | 0 |
| 0.8680555555555555 | 0 |
| 0.86875 | 0 |
| 0.8694444444444445 | 0 |
| 0.8701388888888889 | 0 |
| 0.8708333333333332 | 0 |
| 0.8715277777777778 | 0 |
| 0.8722222222222222 | 0 |
| 0.8729166666666667 | 0 |
| 0.873611111111111 | 0 |
| 0.8743055555555556 | 0 |
| 0.875 | 0 |
| 0.8756944444444444 | 0 |
| 0.876388888888889 | 0 |
| 0.8770833333333333 | 0 |
| 0.8777777777777778 | 0 |
| 0.8784722222222222 | 0 |
| 0.8791666666666668 | 0 |
| 0.8798611111111111 | 0 |
| 0.8805555555555555 | 0 |
| 0.88125 | 0 |
| 0.8819444444444445 | 0 |
| 0.8826388888888889 | 0 |
| 0.8833333333333333 | 0 |
| 0.8840277777777777 | 0 |
| 0.8847222222222223 | 0 |
| 0.8854166666666666 | 0 |
| 0.8861111111111111 | 0 |
| 0.8868055555555556 | 0 |
| 0.8875000000000001 | 0 |
| 0.8881944444444444 | 0 |
| 0.8888888888888888 | 0 |
| 0.8895833333333334 | 0 |
| 0.8902777777777778 | 0 |
| 0.8909722222222222 | 0 |
| 0.8916666666666666 | 0 |
| 0.8923611111111112 | 0 |
| 0.8930555555555556 | 0 |
| 0.8937499999999999 | 0 |
| 0.8944444444444444 | 0 |
| 0.8951388888888889 | 0 |
| 0.8958333333333334 | 0 |
| 0.8965277777777777 | 0 |
| 0.8972222222222223 | 0 |
| 0.8979166666666667 | 0 |
| 0.8986111111111111 | 0 |
| 0.8993055555555555 | 0 |
| 0.9 | 0 |
| 0.9006944444444445 | 0 |
| 0.9013888888888889 | 0 |
| 0.9020833333333332 | 0 |
| 0.9027777777777778 | 0 |
| 0.9034722222222222 | 0 |
| 0.9041666666666667 | 0 |
| 0.904861111111111 | 0 |
| 0.9055555555555556 | 0 |
| 0.90625 | 0 |
| 0.9069444444444444 | 0 |
| 0.907638888888889 | 0 |
| 0.9083333333333333 | 0 |
| 0.9090277777777778 | 0 |
| 0.9097222222222222 | 0 |
| 0.9104166666666668 | 0 |
| 0.9111111111111111 | 0 |
| 0.9118055555555555 | 0 |
| 0.9125 | 0 |
| 0.9131944444444445 | 0 |
| 0.9138888888888889 | 0 |
| 0.9145833333333333 | 0 |
| 0.9152777777777777 | 0 |
| 0.9159722222222223 | 0 |
| 0.9166666666666666 | 0 |
| 0.9173611111111111 | 0 |
| 0.9180555555555556 | 0 |
| 0.9187500000000001 | 0 |
| 0.9194444444444444 | 0 |
| 0.9201388888888888 | 0 |
| 0.9208333333333334 | 0 |
| 0.9215277777777778 | 0 |
| 0.9222222222222222 | 0 |
| 0.9229166666666666 | 0 |
| 0.9236111111111112 | 0 |
| 0.9243055555555556 | 0 |
| 0.9249999999999999 | 0 |
| 0.9256944444444444 | 0 |
| 0.9263888888888889 | 0 |
| 0.9270833333333334 | 0 |
| 0.9277777777777777 | 0 |
| 0.9284722222222223 | 0 |
| 0.9291666666666667 | 0 |
| 0.9298611111111111 | 0 |
| 0.9305555555555555 | 0 |
| 0.93125 | 0 |
| 0.9319444444444445 | 0 |
| 0.9326388888888889 | 0 |
| 0.9333333333333332 | 0 |
| 0.9340277777777778 | 0 |
| 0.9347222222222222 | 0 |
| 0.9354166666666667 | 0 |
| 0.936111111111111 | 0 |
| 0.9368055555555556 | 0 |
| 0.9375 | 0 |
| 0.9381944444444444 | 0 |
| 0.938888888888889 | 0 |
| 0.9395833333333333 | 0 |
| 0.9402777777777778 | 0 |
| 0.9409722222222222 | 0 |
| 0.9416666666666668 | 0 |
| 0.9423611111111111 | 0 |
| 0.9430555555555555 | 0 |
| 0.94375 | 0 |
| 0.9444444444444445 | 0 |
| 0.9451388888888889 | 0 |
| 0.9458333333333333 | 0 |
| 0.9465277777777777 | 0 |
| 0.9472222222222223 | 0 |
| 0.9479166666666666 | 0 |
| 0.9486111111111111 | 0 |
| 0.9493055555555556 | 0 |
| 0.9500000000000001 | 0 |
| 0.9506944444444444 | 0 |
| 0.9513888888888888 | 0 |
| 0.9520833333333334 | 0 |
| 0.9527777777777778 | 0 |
| 0.9534722222222222 | 0 |
| 0.9541666666666666 | 0 |
| 0.9548611111111112 | 0 |
| 0.9555555555555556 | 0 |
| 0.9562499999999999 | 0 |
| 0.9569444444444444 | 0 |
| 0.9576388888888889 | 0 |
| 0.9583333333333334 | 0 |
| 0.9590277777777777 | 0 |
| 0.9597222222222223 | 0 |
| 0.9604166666666667 | 0 |
| 0.9611111111111111 | 0 |
| 0.9618055555555555 | 0 |
| 0.9625 | 0 |
| 0.9631944444444445 | 0 |
| 0.9638888888888889 | 0 |
| 0.9645833333333332 | 0 |
| 0.9652777777777778 | 0 |
| 0.9659722222222222 | 0 |
| 0.9666666666666667 | 0 |
| 0.967361111111111 | 0 |
| 0.9680555555555556 | 0 |
| 0.96875 | 0 |
| 0.9694444444444444 | 0 |
| 0.970138888888889 | 0 |
| 0.9708333333333333 | 0 |
| 0.9715277777777778 | 0 |
| 0.9722222222222222 | 0 |
| 0.9729166666666668 | 0 |
| 0.9736111111111111 | 0 |
| 0.9743055555555555 | 0 |
| 0.975 | 0 |
| 0.9756944444444445 | 0 |
| 0.9763888888888889 | 0 |
| 0.9770833333333333 | 0 |
| 0.9777777777777777 | 0 |
| 0.9784722222222223 | 0 |
| 0.9791666666666666 | 0 |
| 0.9798611111111111 | 0 |
| 0.9805555555555556 | 0 |
| 0.9812500000000001 | 0 |
| 0.9819444444444444 | 0 |
| 0.9826388888888888 | 0 |
| 0.9833333333333334 | 0 |
| 0.9840277777777778 | 0 |
| 0.9847222222222222 | 0 |
| 0.9854166666666666 | 0 |
| 0.9861111111111112 | 0 |
| 0.9868055555555556 | 0 |
| 0.9874999999999999 | 0 |
| 0.9881944444444444 | 0 |
| 0.9888888888888889 | 0 |
| 0.9895833333333334 | 0 |
| 0.9902777777777777 | 0 |
| 0.9909722222222223 | 0 |
| 0.9916666666666667 | 0 |
| 0.9923611111111111 | 0 |
| 0.9930555555555555 | 0 |
| 0.99375 | 0 |
| 0.9944444444444445 | 0 |
| 0.9951388888888889 | 0 |
| 0.9958333333333332 | 0 |
| 0.9965277777777778 | 0 |
| 0.9972222222222222 | 0 |
| 0.9979166666666667 | 0 |
| 0.998611111111111 | 0 |
| 0.9993055555555556 | 0 |